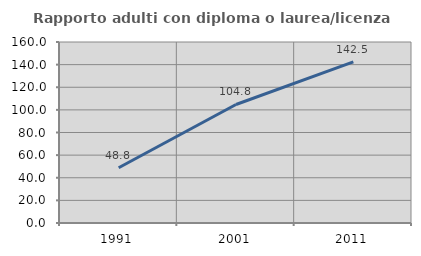
| Category | Rapporto adulti con diploma o laurea/licenza media  |
|---|---|
| 1991.0 | 48.792 |
| 2001.0 | 104.781 |
| 2011.0 | 142.453 |